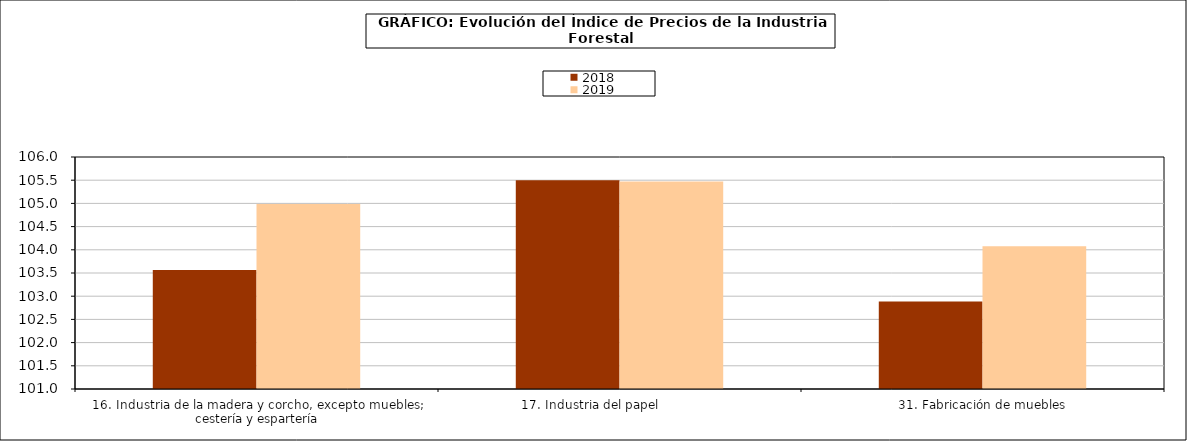
| Category | 2018 | 2019 |
|---|---|---|
| 16. Industria de la madera y corcho, excepto muebles; cestería y espartería | 103.567 | 104.986 |
| 17. Industria del papel                | 105.498 | 105.472 |
| 31. Fabricación de muebles | 102.886 | 104.076 |